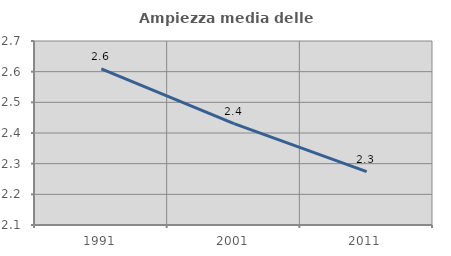
| Category | Ampiezza media delle famiglie |
|---|---|
| 1991.0 | 2.609 |
| 2001.0 | 2.431 |
| 2011.0 | 2.274 |